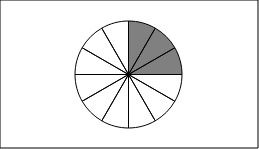
| Category | Series 0 | Series 1 |
|---|---|---|
| 0 | 1 |  |
| 1 | 1 |  |
| 2 | 1 |  |
| 3 | 1 |  |
| 4 | 1 |  |
| 5 | 1 |  |
| 6 | 1 |  |
| 7 | 1 |  |
| 8 | 1 |  |
| 9 | 1 |  |
| 10 | 1 |  |
| 11 | 1 |  |